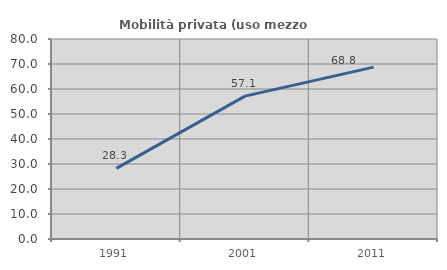
| Category | Mobilità privata (uso mezzo privato) |
|---|---|
| 1991.0 | 28.261 |
| 2001.0 | 57.143 |
| 2011.0 | 68.75 |